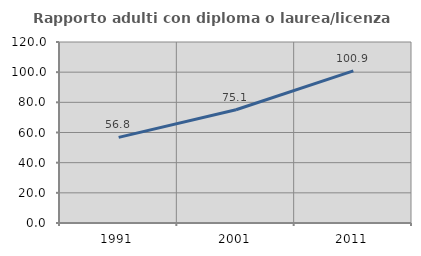
| Category | Rapporto adulti con diploma o laurea/licenza media  |
|---|---|
| 1991.0 | 56.774 |
| 2001.0 | 75.057 |
| 2011.0 | 100.887 |